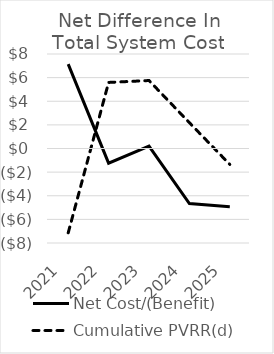
| Category | Net Cost/(Benefit) | Cumulative PVRR(d) |
|---|---|---|
| 2021.0 | 7.14 | -7.14 |
| 2022.0 | -1.243 | 5.593 |
| 2023.0 | 0.198 | 5.755 |
| 2024.0 | -4.661 | 2.183 |
| 2025.0 | -4.924 | -1.348 |